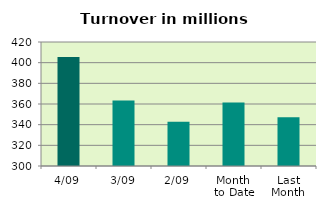
| Category | Series 0 |
|---|---|
| 4/09 | 405.484 |
| 3/09 | 363.409 |
| 2/09 | 342.783 |
| Month 
to Date | 361.375 |
| Last
Month | 347.074 |